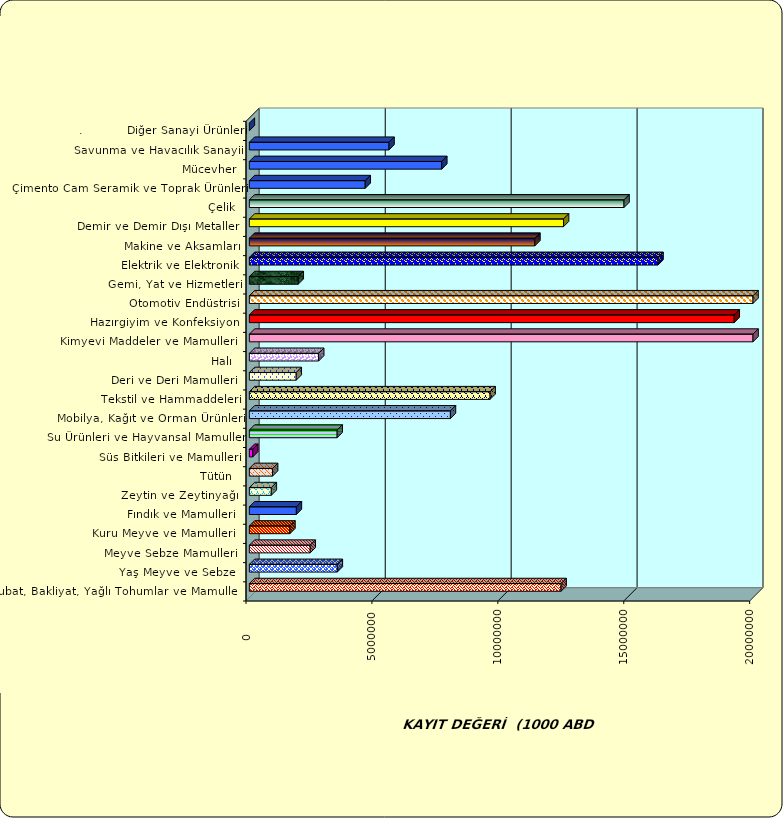
| Category | Series 0 |
|---|---|
|  Hububat, Bakliyat, Yağlı Tohumlar ve Mamulleri  | 12378672.109 |
|  Yaş Meyve ve Sebze   | 3492313.608 |
|  Meyve Sebze Mamulleri  | 2416442.895 |
|  Kuru Meyve ve Mamulleri   | 1610304.072 |
|  Fındık ve Mamulleri  | 1866735.417 |
|  Zeytin ve Zeytinyağı  | 871666.319 |
|  Tütün  | 922336.902 |
|  Süs Bitkileri ve Mamulleri | 135139.405 |
|  Su Ürünleri ve Hayvansal Mamuller | 3486857.447 |
|  Mobilya, Kağıt ve Orman Ürünleri | 7983784.96 |
|  Tekstil ve Hammaddeleri | 9558446.816 |
|  Deri ve Deri Mamulleri  | 1860994.943 |
|  Halı  | 2752646.965 |
|  Kimyevi Maddeler ve Mamulleri   | 30572011.916 |
|  Hazırgiyim ve Konfeksiyon  | 19253722.265 |
|  Otomotiv Endüstrisi | 35004229.979 |
|  Gemi, Yat ve Hizmetleri | 1940979.346 |
|  Elektrik ve Elektronik | 16227067.064 |
|  Makine ve Aksamları | 11337756.475 |
|  Demir ve Demir Dışı Metaller  | 12475761.778 |
|  Çelik | 14877836.23 |
|  Çimento Cam Seramik ve Toprak Ürünleri | 4601376.559 |
|  Mücevher | 7640636.874 |
|  Savunma ve Havacılık Sanayii | 5545621.603 |
| .           Diğer Sanayi Ürünleri | 0 |